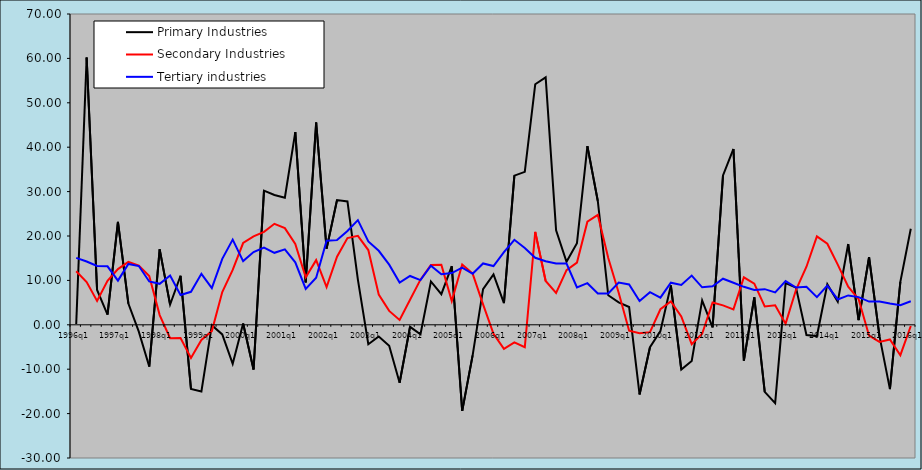
| Category | Primary Industries | Secondary Industries | Tertiary industries |
|---|---|---|---|
| 1996q1 | 0.197 | 12.067 | 15.082 |
| 1996q2 | 60.22 | 9.62 | 14.253 |
| 1996q3 | 7.835 | 5.367 | 13.267 |
| 1996q4 | 2.298 | 9.91 | 13.167 |
| 1997q1 | 23.156 | 12.548 | 9.954 |
| 1997q2 | 4.796 | 14.183 | 13.707 |
| 1997q3 | -1.531 | 13.322 | 13.235 |
| 1997q4 | -9.408 | 10.981 | 9.764 |
| 1998q1 | 16.981 | 2.181 | 9.229 |
| 1998q2 | 4.557 | -3.016 | 11.087 |
| 1998q3 | 11.053 | -2.986 | 6.716 |
| 1998q4 | -14.445 | -7.472 | 7.434 |
| 1999q1 | -15.007 | -3.417 | 11.482 |
| 1999q2 | -0.084 | -1.426 | 8.252 |
| 1999q3 | -2.173 | 7.362 | 14.849 |
| 1999q4 | -8.784 | 12.355 | 19.184 |
| 2000q1 | 0.285 | 18.417 | 14.346 |
| 2000q2 | -10.057 | 19.929 | 16.4 |
| 2000q3 | 30.221 | 20.947 | 17.405 |
| 2000q4 | 29.246 | 22.753 | 16.213 |
| 2001q1 | 28.626 | 21.768 | 16.993 |
| 2001q2 | 43.406 | 18.189 | 14.078 |
| 2001q3 | 9.542 | 10.686 | 8.088 |
| 2001q4 | 45.557 | 14.569 | 10.605 |
| 2002q1 | 17.155 | 8.511 | 18.947 |
| 2002q2 | 28.084 | 15.322 | 19.071 |
| 2002q3 | 27.775 | 19.543 | 21.135 |
| 2002q4 | 10.181 | 20.035 | 23.574 |
| 2003q1 | -4.371 | 16.838 | 18.786 |
| 2003q2 | -2.638 | 6.812 | 16.671 |
| 2003q3 | -4.725 | 3.128 | 13.554 |
| 2003q4 | -13.053 | 1.089 | 9.519 |
| 2004q1 | -0.457 | 5.651 | 10.994 |
| 2004q2 | -2.137 | 10.168 | 10.07 |
| 2004q3 | 9.764 | 13.485 | 13.326 |
| 2004q4 | 6.888 | 13.506 | 11.407 |
| 2005q1 | 13.196 | 5.343 | 11.652 |
| 2005q2 | -19.385 | 13.56 | 12.863 |
| 2005q3 | -6.872 | 11.541 | 11.485 |
| 2005q4 | 8.044 | 4.613 | 13.825 |
| 2006q1 | 11.363 | -2.047 | 13.234 |
| 2006q2 | 4.868 | -5.405 | 16.388 |
| 2006q3 | 33.598 | -3.956 | 19.153 |
| 2006q4 | 34.455 | -5.06 | 17.318 |
| 2007q1 | 54.175 | 20.931 | 15.086 |
| 2007q2 | 55.724 | 9.878 | 14.329 |
| 2007q3 | 21.277 | 7.169 | 13.815 |
| 2007q4 | 14.205 | 12.324 | 13.797 |
| 2008q1 | 18.387 | 14.006 | 8.436 |
| 2008q2 | 40.243 | 23.214 | 9.372 |
| 2008q3 | 27.873 | 24.754 | 7.051 |
| 2008q4 | 6.65 | 15.046 | 7.05 |
| 2009q1 | 5.066 | 7.211 | 9.518 |
| 2009q2 | 4.002 | -1.331 | 9.078 |
| 2009q3 | -15.684 | -1.902 | 5.349 |
| 2009q4 | -5.054 | -1.662 | 7.352 |
| 2010q1 | -1.416 | 3.509 | 6.115 |
| 2010q2 | 8.86 | 5.245 | 9.484 |
| 2010q3 | -10.061 | 1.893 | 8.972 |
| 2010q4 | -8.146 | -4.356 | 11.08 |
| 2011q1 | 5.493 | -2.032 | 8.447 |
| 2011q2 | -0.586 | 5.041 | 8.679 |
| 2011q3 | 33.65 | 4.37 | 10.373 |
| 2011q4 | 39.61 | 3.48 | 9.474 |
| 2012q1 | -8.056 | 10.696 | 8.552 |
| 2012q2 | 6.184 | 9.276 | 7.844 |
| 2012q3 | -15.101 | 4.15 | 8.029 |
| 2012q4 | -17.638 | 4.394 | 7.308 |
| 2013q1 | 9.386 | 0.261 | 9.842 |
| 2013q2 | 8.378 | 7.883 | 8.39 |
| 2013q3 | -2.3 | 13.078 | 8.546 |
| 2013q4 | -2.538 | 19.906 | 6.222 |
| 2014q1 | 9.133 | 18.248 | 8.843 |
| 2014q2 | 5.211 | 13.563 | 5.709 |
| 2014q3 | 18.194 | 8.573 | 6.614 |
| 2014q4 | 1.06 | 5.759 | 6.235 |
| 2015q1 | 15.216 | -2.454 | 5.231 |
| 2015q2 | -2.542 | -3.853 | 5.231 |
| 2015q3 | -14.483 | -3.312 | 4.799 |
| 2015q4 | 9.661 | -6.848 | 4.433 |
| 2016q1 | 21.62 | -0.271 | 5.302 |